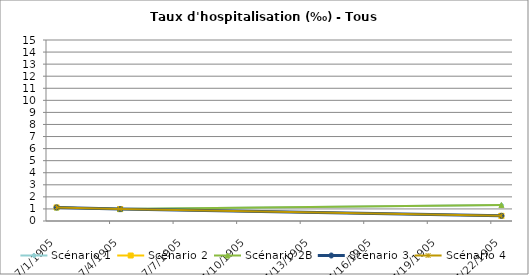
| Category | Scénario 1 | Scénario 2 | Scénario 2B | Scénario 3 | Scénario 4 |
|---|---|---|---|---|---|
| 2009.0 | 1.125 | 1.125 | 1.125 | 1.125 | 1.125 |
| 2012.0 | 0.988 | 0.988 | 0.988 | 0.988 | 0.988 |
| 2030.0 | 1.32 | 0.43 | 1.32 | 0.43 | 0.43 |